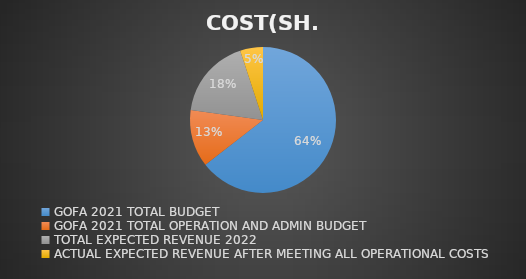
| Category | COST(SH.) |
|---|---|
| GOFA 2021 TOTAL BUDGET | 559278000 |
| GOFA 2021 TOTAL OPERATION AND ADMIN BUDGET | 110304000 |
| TOTAL EXPECTED REVENUE 2022 | 154155800 |
| ACTUAL EXPECTED REVENUE AFTER MEETING ALL OPERATIONAL COSTS | 43851800 |